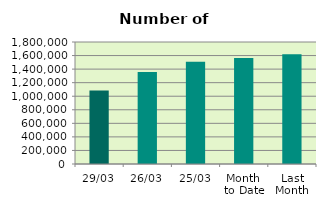
| Category | Series 0 |
|---|---|
| 29/03 | 1082976 |
| 26/03 | 1358352 |
| 25/03 | 1509604 |
| Month 
to Date | 1562242.286 |
| Last
Month | 1618522.4 |